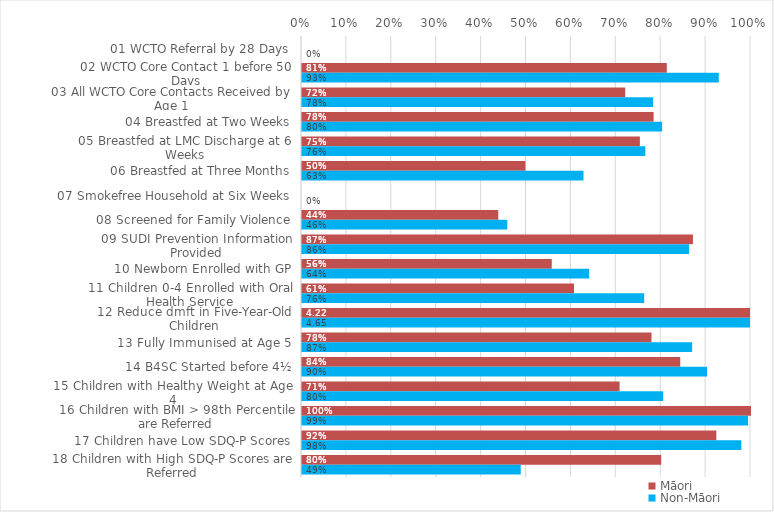
| Category | Māori | Non-Māori |
|---|---|---|
| 01 WCTO Referral by 28 Days | 0 | 0 |
| 02 WCTO Core Contact 1 before 50 Days | 0.812 | 0.928 |
| 03 All WCTO Core Contacts Received by Age 1 | 0.72 | 0.782 |
| 04 Breastfed at Two Weeks | 0.783 | 0.802 |
| 05 Breastfed at LMC Discharge at 6 Weeks | 0.752 | 0.765 |
| 06 Breastfed at Three Months | 0.497 | 0.627 |
| 07 Smokefree Household at Six Weeks | 0 | 0 |
| 08 Screened for Family Violence | 0.437 | 0.457 |
| 09 SUDI Prevention Information Provided | 0.871 | 0.862 |
| 10 Newborn Enrolled with GP | 0.556 | 0.64 |
| 11 Children 0-4 Enrolled with Oral Health Service | 0.606 | 0.762 |
| 12 Reduce dmft in Five-Year-Old Children | 4.222 | 4.65 |
| 13 Fully Immunised at Age 5 | 0.778 | 0.869 |
| 14 B4SC Started before 4½ | 0.842 | 0.902 |
| 15 Children with Healthy Weight at Age 4 | 0.707 | 0.804 |
| 16 Children with BMI > 98th Percentile are Referred | 1 | 0.994 |
| 17 Children have Low SDQ-P Scores | 0.923 | 0.978 |
| 18 Children with High SDQ-P Scores are Referred | 0.8 | 0.487 |